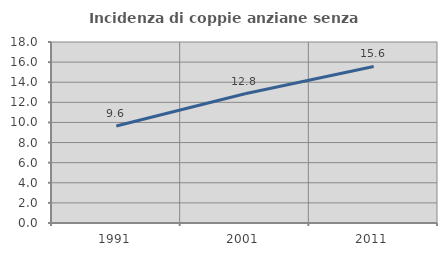
| Category | Incidenza di coppie anziane senza figli  |
|---|---|
| 1991.0 | 9.645 |
| 2001.0 | 12.848 |
| 2011.0 | 15.57 |